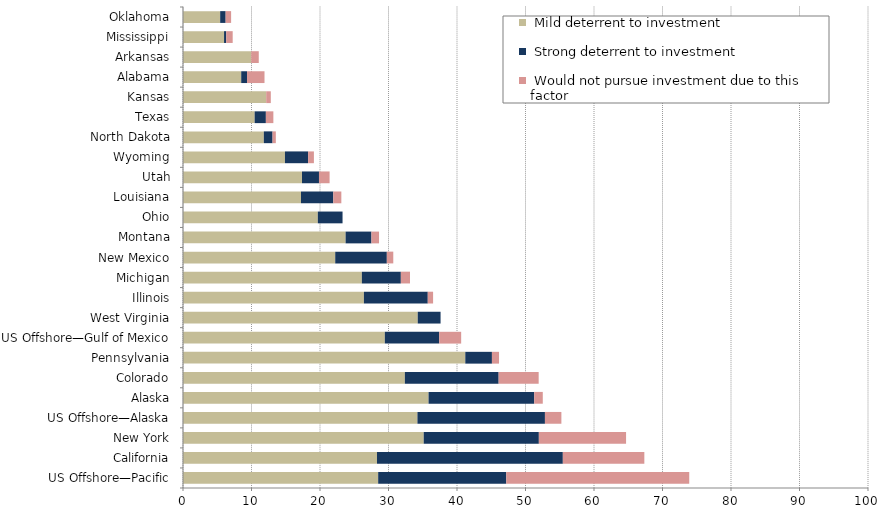
| Category |  Mild deterrent to investment |  Strong deterrent to investment |  Would not pursue investment due to this factor |
|---|---|---|---|
| US Offshore—Pacific | 28.493 | 18.699 | 26.712 |
| California | 28.32 | 27.13 | 11.899 |
| New York | 35.142 | 16.807 | 12.732 |
| US Offshore—Alaska | 34.224 | 18.613 | 2.402 |
| Alaska | 35.849 | 15.423 | 1.251 |
| Colorado | 32.389 | 13.69 | 5.843 |
| Pennsylvania | 41.211 | 3.888 | 1.037 |
| US Offshore—Gulf of Mexico | 29.464 | 7.933 | 3.211 |
| West Virginia | 34.269 | 3.332 | 0 |
| Illinois | 26.411 | 9.322 | 0.777 |
| Michigan | 26.111 | 5.691 | 1.339 |
| New Mexico | 22.223 | 7.533 | 0.942 |
| Montana | 23.738 | 3.771 | 1.109 |
| Ohio | 19.683 | 3.608 | 0 |
| Louisiana | 17.226 | 4.711 | 1.178 |
| Utah | 17.369 | 2.481 | 1.551 |
| Wyoming | 14.882 | 3.382 | 0.846 |
| North Dakota | 11.798 | 1.275 | 0.478 |
| Texas | 10.459 | 1.639 | 1.093 |
| Kansas | 12.144 | 0 | 0.675 |
| Alabama | 8.499 | 0.85 | 2.55 |
| Arkansas | 9.955 | 0 | 1.106 |
| Mississippi | 5.993 | 0.315 | 0.946 |
| Oklahoma | 5.427 | 0.798 | 0.798 |